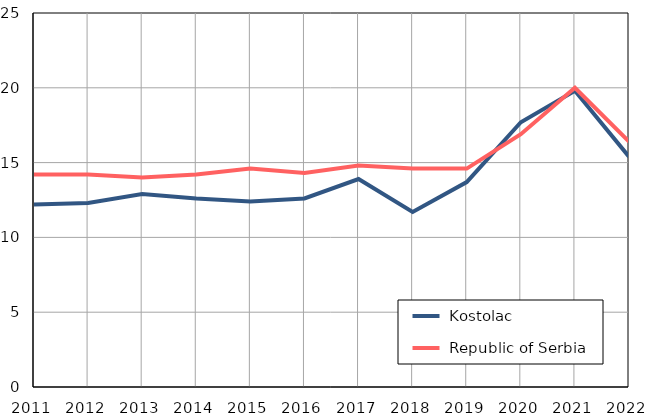
| Category |  Kostolac |  Republic of Serbia |
|---|---|---|
| 2011.0 | 12.2 | 14.2 |
| 2012.0 | 12.3 | 14.2 |
| 2013.0 | 12.9 | 14 |
| 2014.0 | 12.6 | 14.2 |
| 2015.0 | 12.4 | 14.6 |
| 2016.0 | 12.6 | 14.3 |
| 2017.0 | 13.9 | 14.8 |
| 2018.0 | 11.7 | 14.6 |
| 2019.0 | 13.7 | 14.6 |
| 2020.0 | 17.7 | 16.9 |
| 2021.0 | 19.8 | 20 |
| 2022.0 | 15.4 | 16.4 |